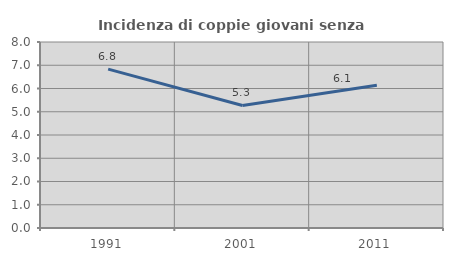
| Category | Incidenza di coppie giovani senza figli |
|---|---|
| 1991.0 | 6.832 |
| 2001.0 | 5.27 |
| 2011.0 | 6.136 |